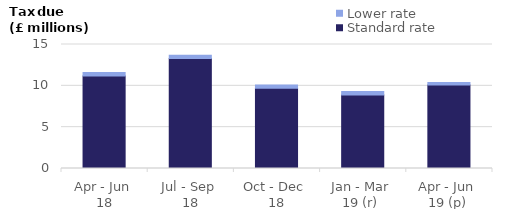
| Category | Standard rate | Lower rate |
|---|---|---|
| Apr - Jun 
18 | 11.2 | 0.4 |
| Jul - Sep 
18 | 13.3 | 0.4 |
| Oct - Dec 
18 | 9.7 | 0.4 |
| Jan - Mar 
19 (r)  | 8.9 | 0.4 |
| Apr - Jun 
19 (p) | 10.1 | 0.3 |